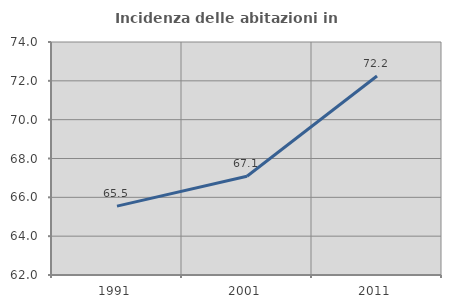
| Category | Incidenza delle abitazioni in proprietà  |
|---|---|
| 1991.0 | 65.546 |
| 2001.0 | 67.089 |
| 2011.0 | 72.247 |